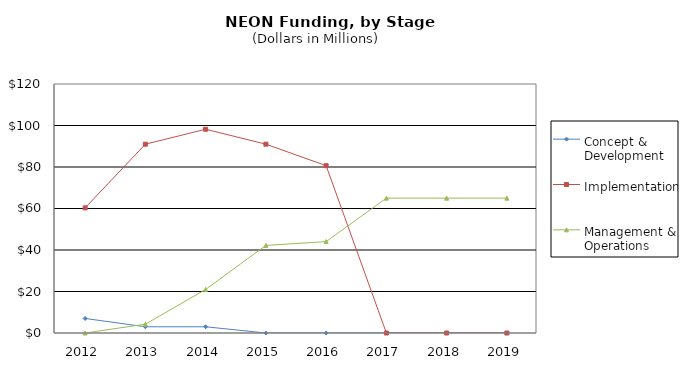
| Category | Concept & Development | Implementation | Management & Operations |
|---|---|---|---|
| 2012 | 7 | 60.295 | 0 |
| 2013 | 3 | 91 | 4.25 |
| 2014 | 3 | 98.2 | 21 |
| 2015 | 0 | 91 | 42.22 |
| 2016 | 0 | 80.64 | 44.04 |
| 2017 | 0 | 0 | 65 |
| 2018 | 0 | 0 | 65 |
| 2019 | 0 | 0 | 65 |